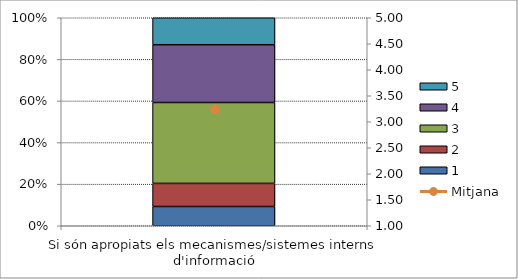
| Category | 1 | 2 | 3 | 4 | 5 |
|---|---|---|---|---|---|
| Si són apropiats els mecanismes/sistemes interns d'informació | 5 | 6 | 21 | 15 | 7 |